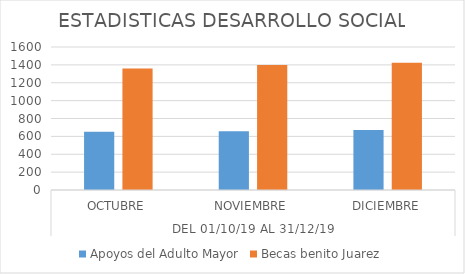
| Category | Apoyos del Adulto Mayor | Becas benito Juarez |
|---|---|---|
| 0 | 652 | 1360 |
| 1 | 657 | 1400 |
| 2 | 672 | 1423 |